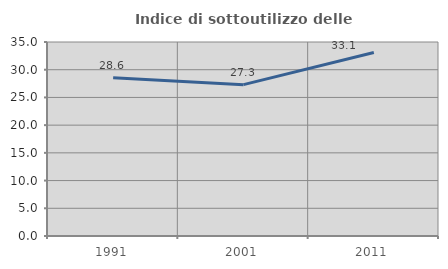
| Category | Indice di sottoutilizzo delle abitazioni  |
|---|---|
| 1991.0 | 28.571 |
| 2001.0 | 27.303 |
| 2011.0 | 33.117 |